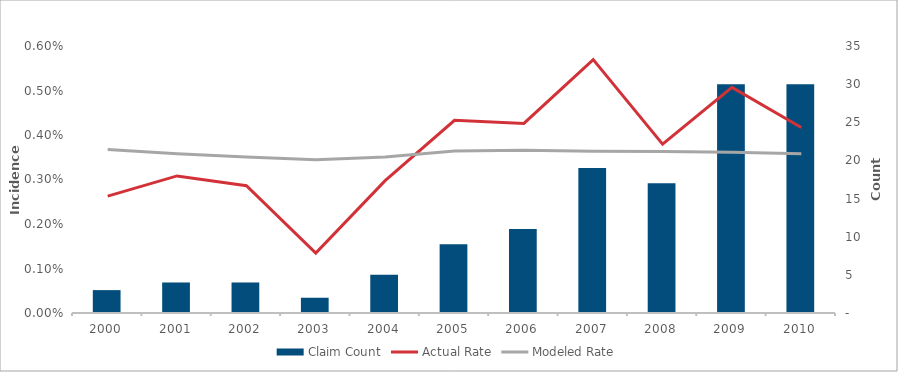
| Category | Claim Count |
|---|---|
| 2000.0 | 3 |
| 2001.0 | 4 |
| 2002.0 | 4 |
| 2003.0 | 2 |
| 2004.0 | 5 |
| 2005.0 | 9 |
| 2006.0 | 11 |
| 2007.0 | 19 |
| 2008.0 | 17 |
| 2009.0 | 30 |
| 2010.0 | 30 |